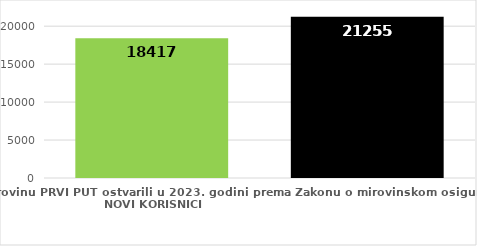
| Category | broj korisnika |
|---|---|
| Korisnici koji su pravo na mirovinu PRVI PUT ostvarili u 2023. godini prema Zakonu o mirovinskom osiguranju - NOVI KORISNICI | 18417 |
| Korisnici mirovina kojima je u 2023. godini PRESTALO PRAVO NA MIROVINU - uzrok smrt 
koji su pravo na mirovinu ostvarili prema Zakonu o mirovinskom osiguranju | 21255 |